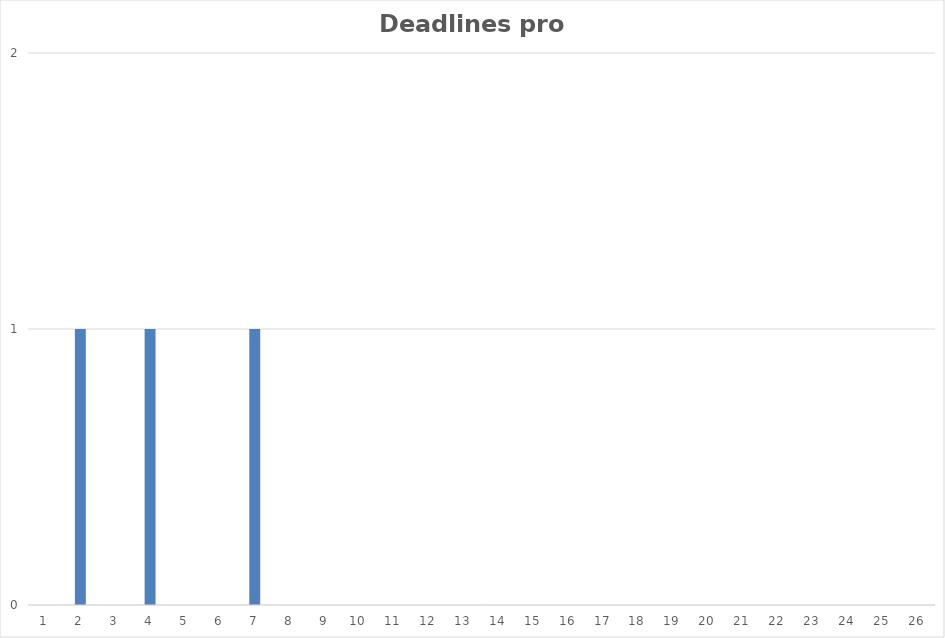
| Category | Deadlines pro Semesterwoche |
|---|---|
| 0 | 0 |
| 1 | 1 |
| 2 | 0 |
| 3 | 1 |
| 4 | 0 |
| 5 | 0 |
| 6 | 1 |
| 7 | 0 |
| 8 | 0 |
| 9 | 0 |
| 10 | 0 |
| 11 | 0 |
| 12 | 0 |
| 13 | 0 |
| 14 | 0 |
| 15 | 0 |
| 16 | 0 |
| 17 | 0 |
| 18 | 0 |
| 19 | 0 |
| 20 | 0 |
| 21 | 0 |
| 22 | 0 |
| 23 | 0 |
| 24 | 0 |
| 25 | 0 |